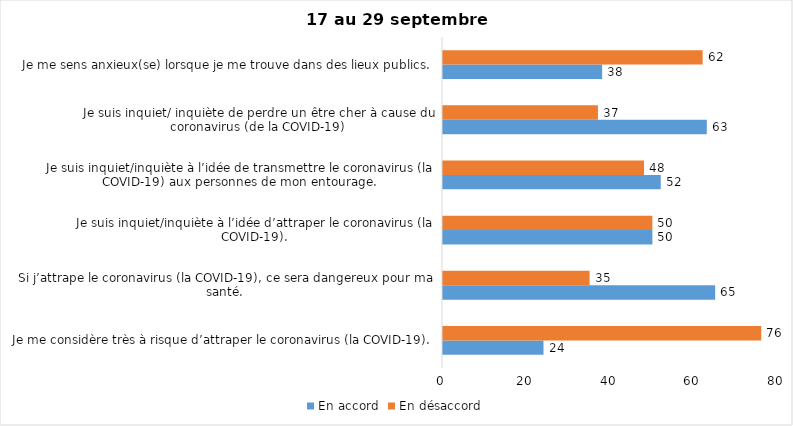
| Category | En accord | En désaccord |
|---|---|---|
| Je me considère très à risque d’attraper le coronavirus (la COVID-19). | 24 | 76 |
| Si j’attrape le coronavirus (la COVID-19), ce sera dangereux pour ma santé. | 65 | 35 |
| Je suis inquiet/inquiète à l’idée d’attraper le coronavirus (la COVID-19). | 50 | 50 |
| Je suis inquiet/inquiète à l’idée de transmettre le coronavirus (la COVID-19) aux personnes de mon entourage. | 52 | 48 |
| Je suis inquiet/ inquiète de perdre un être cher à cause du coronavirus (de la COVID-19) | 63 | 37 |
| Je me sens anxieux(se) lorsque je me trouve dans des lieux publics. | 38 | 62 |